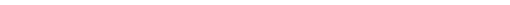
| Category | Series 0 |
|---|---|
| Space Heating | 20.948 |
| Space Cooling | 0 |